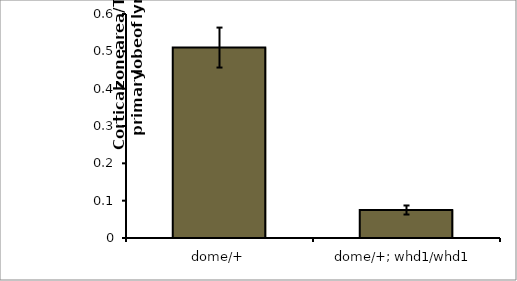
| Category | Series 0 |
|---|---|
| dome/+ | 0.51 |
| dome/+; whd1/whd1 | 0.075 |